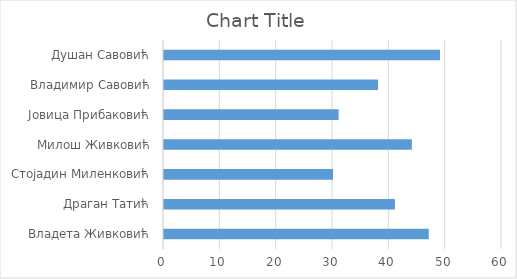
| Category | Series 0 |
|---|---|
| Владета Живковић | 47 |
| Драган Татић | 41 |
| Стојадин Миленковић | 30 |
| Милош Живковић | 44 |
| Јовица Прибаковић | 31 |
| Владимир Савовић | 38 |
| Душан Савовић | 49 |